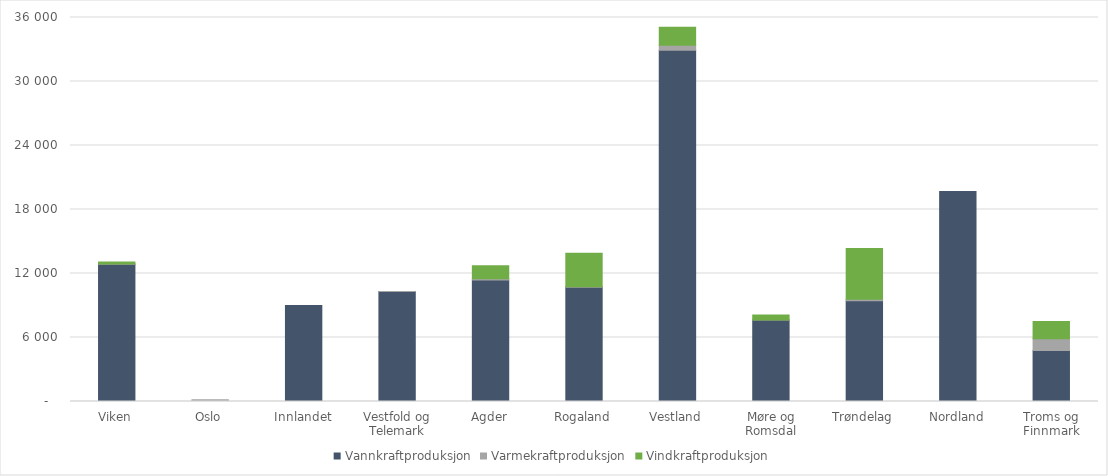
| Category | Vannkraftproduksjon | Varmekraftproduksjon | Vindkraftproduksjon |
|---|---|---|---|
| Viken | 12869 | 32 | 179 |
| Oslo | 13 | 141 | 0 |
| Innlandet | 9008 | 0 | 0 |
| Vestfold og Telemark | 10309 | 10 | 0 |
| Agder | 11390 | 129 | 1199 |
| Rogaland | 10705 | 45 | 3155 |
| Vestland | 32923 | 479 | 1678 |
| Møre og Romsdal | 7635 | 1 | 462 |
| Trøndelag | 9438 | 138 | 4764 |
| Nordland | 19686 | 0 | 0 |
| Troms og Finnmark | 4774 | 1110 | 1625 |